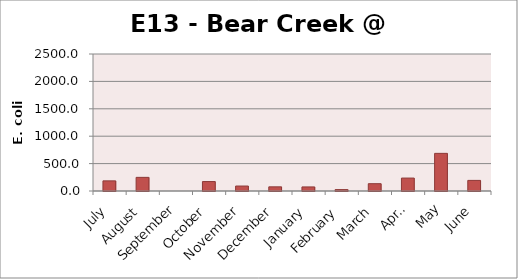
| Category | E. coli MPN |
|---|---|
| July | 185 |
| August | 248.9 |
| September | 0 |
| October | 172.3 |
| November | 90.6 |
| December | 75.9 |
| January | 74.4 |
| February | 25.6 |
| March | 133.3 |
| April | 235.9 |
| May | 686.7 |
| June | 193.5 |